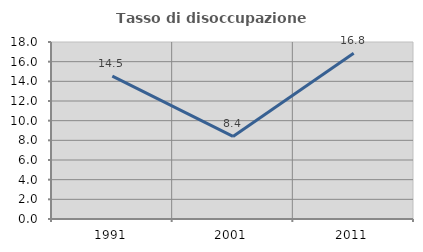
| Category | Tasso di disoccupazione giovanile  |
|---|---|
| 1991.0 | 14.529 |
| 2001.0 | 8.397 |
| 2011.0 | 16.845 |